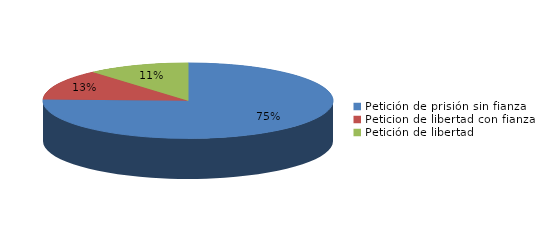
| Category | Series 0 |
|---|---|
| Petición de prisión sin fianza | 40 |
| Peticion de libertad con fianza | 7 |
| Petición de libertad | 6 |